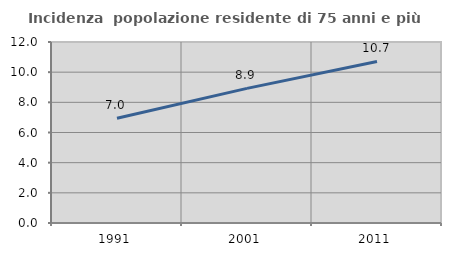
| Category | Incidenza  popolazione residente di 75 anni e più |
|---|---|
| 1991.0 | 6.95 |
| 2001.0 | 8.927 |
| 2011.0 | 10.712 |